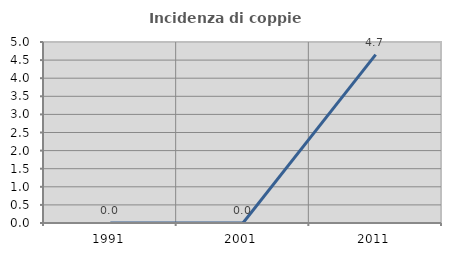
| Category | Incidenza di coppie miste |
|---|---|
| 1991.0 | 0 |
| 2001.0 | 0 |
| 2011.0 | 4.651 |